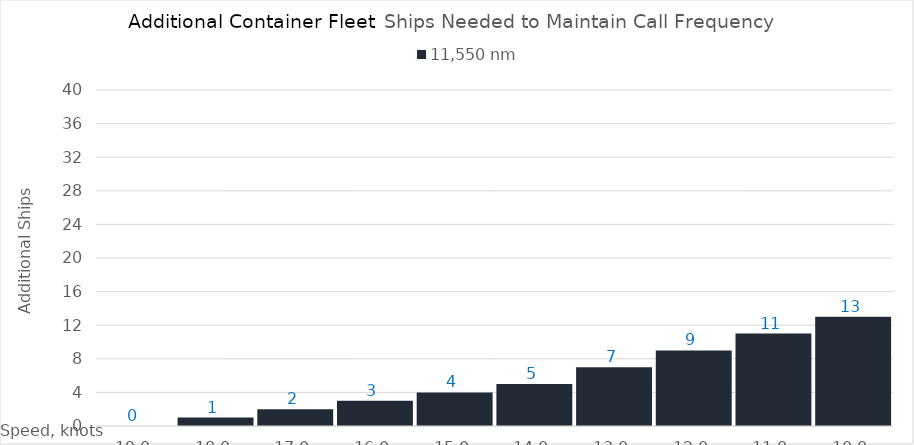
| Category | 11,550 |
|---|---|
| 19.0 | 0 |
| 18.0 | 1 |
| 17.0 | 2 |
| 16.0 | 3 |
| 15.0 | 4 |
| 14.0 | 5 |
| 13.0 | 7 |
| 12.0 | 9 |
| 11.0 | 11 |
| 10.0 | 13 |